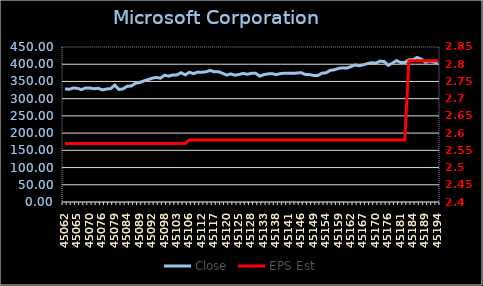
| Category | Close |
|---|---|
| 0 | 328.544 |
| 1 | 327.12 |
| 2 | 331.134 |
| 3 | 329.879 |
| 4 | 326.462 |
| 5 | 331.353 |
| 6 | 330.776 |
| 7 | 328.833 |
| 8 | 330.039 |
| 9 | 325.407 |
| 10 | 328.046 |
| 11 | 329.252 |
| 12 | 339.352 |
| 13 | 326.622 |
| 14 | 328.534 |
| 15 | 336.005 |
| 16 | 336.802 |
| 17 | 344.732 |
| 18 | 346.973 |
| 19 | 351.435 |
| 20 | 355.151 |
| 21 | 359.136 |
| 22 | 361.795 |
| 23 | 359.295 |
| 24 | 368.24 |
| 25 | 365.262 |
| 26 | 368.838 |
| 27 | 368.988 |
| 28 | 375.476 |
| 29 | 369.167 |
| 30 | 376.743 |
| 31 | 372.381 |
| 32 | 377.153 |
| 33 | 376.733 |
| 34 | 377.911 |
| 35 | 381.994 |
| 36 | 378.151 |
| 37 | 378.211 |
| 38 | 373.819 |
| 39 | 368.459 |
| 40 | 371.832 |
| 41 | 368.119 |
| 42 | 370.265 |
| 43 | 373.539 |
| 44 | 370.615 |
| 45 | 373.689 |
| 46 | 373.679 |
| 47 | 365.255 |
| 48 | 370.046 |
| 49 | 371.962 |
| 50 | 372.571 |
| 51 | 369.936 |
| 52 | 372.851 |
| 53 | 373.889 |
| 54 | 373.968 |
| 55 | 373.38 |
| 56 | 374.587 |
| 57 | 375.346 |
| 58 | 370.185 |
| 59 | 369.916 |
| 60 | 367.261 |
| 61 | 367.071 |
| 62 | 373.998 |
| 63 | 375.096 |
| 64 | 382.063 |
| 65 | 383.92 |
| 66 | 387.753 |
| 67 | 389.55 |
| 68 | 388.751 |
| 69 | 393.143 |
| 70 | 397.934 |
| 71 | 395.778 |
| 72 | 398.164 |
| 73 | 401.817 |
| 74 | 404.123 |
| 75 | 403.184 |
| 76 | 408.964 |
| 77 | 407.836 |
| 78 | 396.846 |
| 79 | 403.035 |
| 80 | 410.461 |
| 81 | 404.901 |
| 82 | 404.742 |
| 83 | 413.286 |
| 84 | 413.346 |
| 85 | 419.774 |
| 86 | 414.494 |
| 87 | 405.57 |
| 88 | 409.49 |
| 89 | 406.56 |
| 90 | 404.06 |